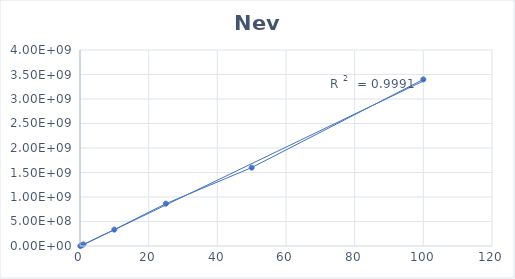
| Category | Series 0 |
|---|---|
| 0.1 | 770000 |
| 0.5 | 15780000 |
| 1.0 | 32590000 |
| 10.0 | 335000000 |
| 25.0 | 864000000 |
| 50.0 | 1600000000 |
| 100.0 | 3400000000 |